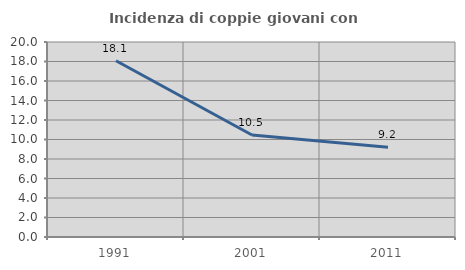
| Category | Incidenza di coppie giovani con figli |
|---|---|
| 1991.0 | 18.082 |
| 2001.0 | 10.458 |
| 2011.0 | 9.199 |